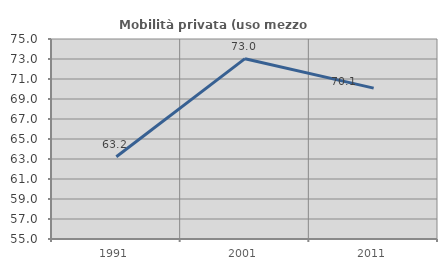
| Category | Mobilità privata (uso mezzo privato) |
|---|---|
| 1991.0 | 63.221 |
| 2001.0 | 73.034 |
| 2011.0 | 70.09 |